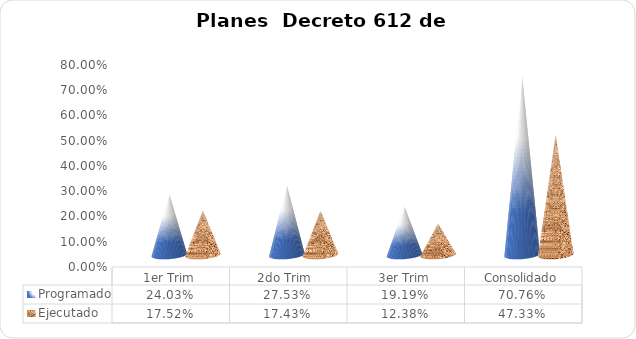
| Category | Programado | Ejecutado  |
|---|---|---|
| 1er Trim | 0.24 | 0.175 |
| 2do Trim  | 0.275 | 0.174 |
| 3er Trim | 0.192 | 0.124 |
| Consolidado | 0.708 | 0.473 |